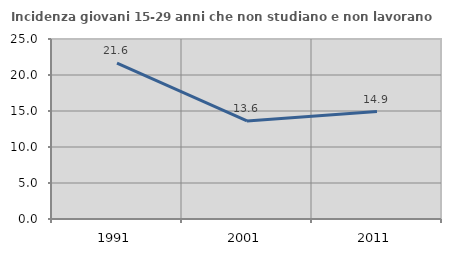
| Category | Incidenza giovani 15-29 anni che non studiano e non lavorano  |
|---|---|
| 1991.0 | 21.639 |
| 2001.0 | 13.613 |
| 2011.0 | 14.925 |